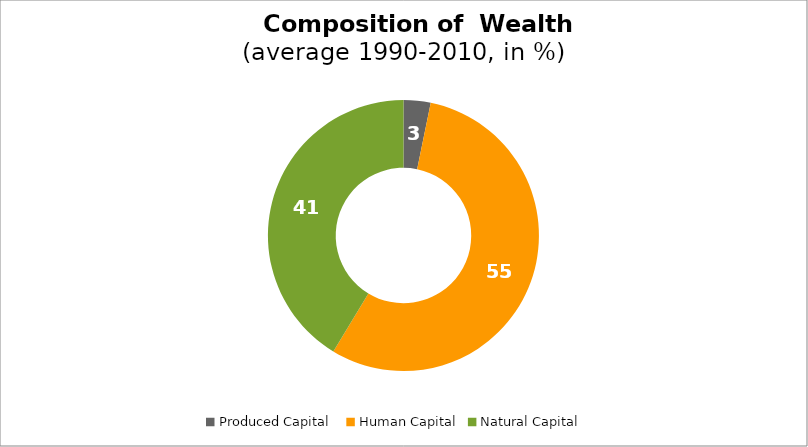
| Category | Series 0 |
|---|---|
| Produced Capital  | 3.225 |
| Human Capital | 55.44 |
| Natural Capital | 41.334 |